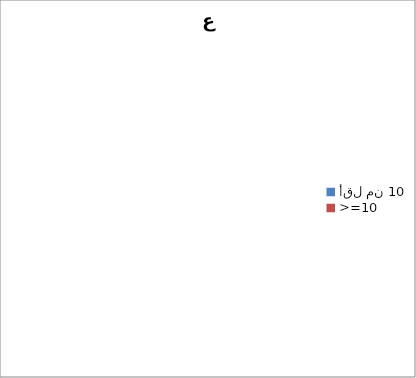
| Category | مجموع |
|---|---|
| أقل من 10 | 0 |
| >=10 | 0 |